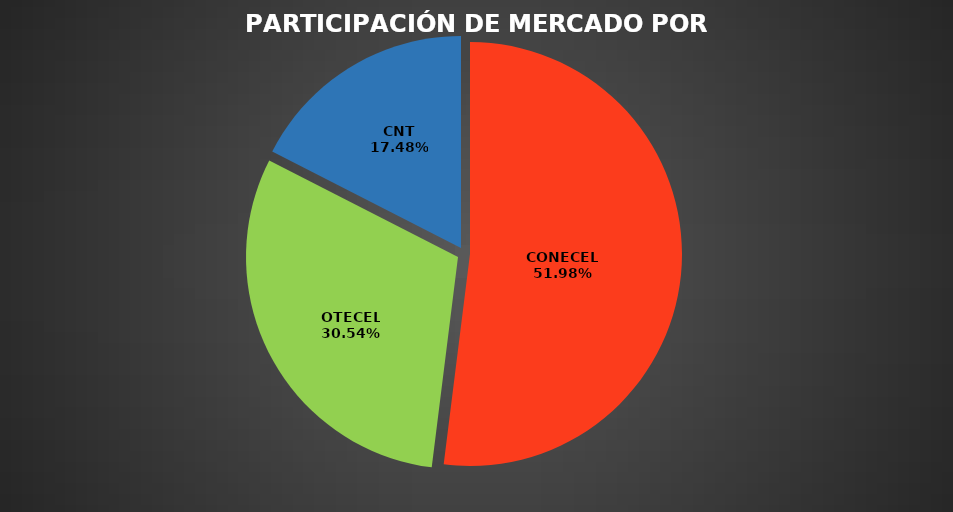
| Category | Jun 2023 |
|---|---|
| CONECEL | 9290231 |
| OTECEL | 5458655 |
| CNT | 3123905 |